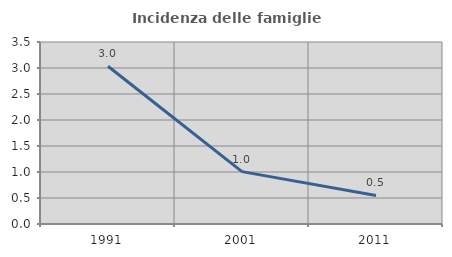
| Category | Incidenza delle famiglie numerose |
|---|---|
| 1991.0 | 3.033 |
| 2001.0 | 1.007 |
| 2011.0 | 0.549 |